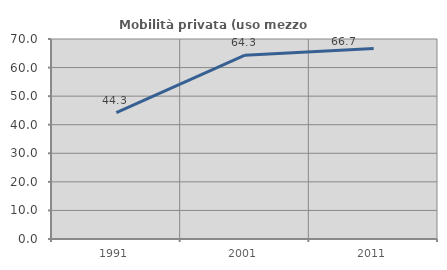
| Category | Mobilità privata (uso mezzo privato) |
|---|---|
| 1991.0 | 44.252 |
| 2001.0 | 64.34 |
| 2011.0 | 66.667 |